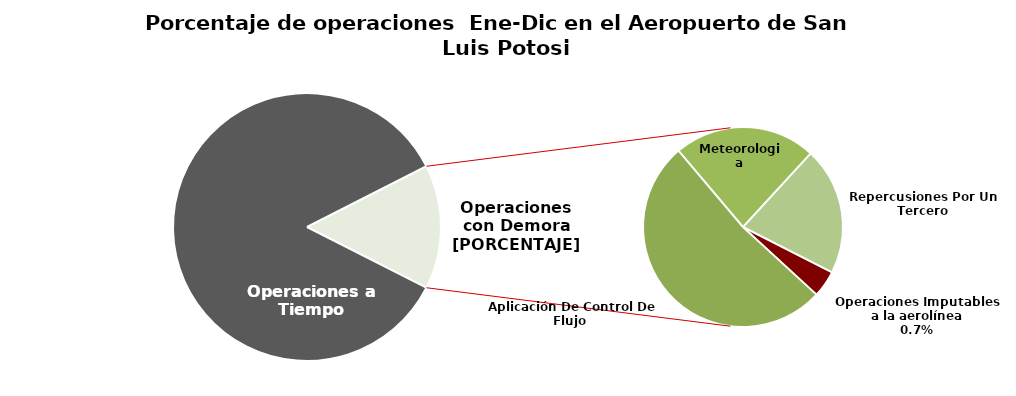
| Category | Series 0 |
|---|---|
| Operaciones a Tiempo | 5359 |
| Operaciones Imputables a la aerolínea | 41 |
| Aplicación De Control De Flujo  | 491 |
| Meteorologia | 217 |
| Repercusiones Por Un Tercero | 195 |